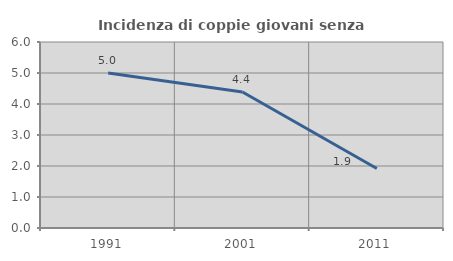
| Category | Incidenza di coppie giovani senza figli |
|---|---|
| 1991.0 | 5.002 |
| 2001.0 | 4.387 |
| 2011.0 | 1.921 |